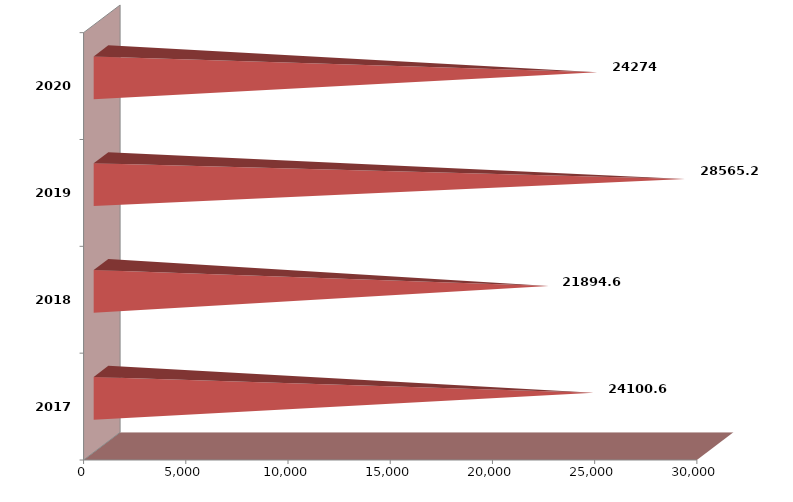
| Category | Series 1 |
|---|---|
| 2017 | 24100596 |
| 2018 | 21894629 |
| 2019 | 28565244 |
| 2020 | 24274424 |